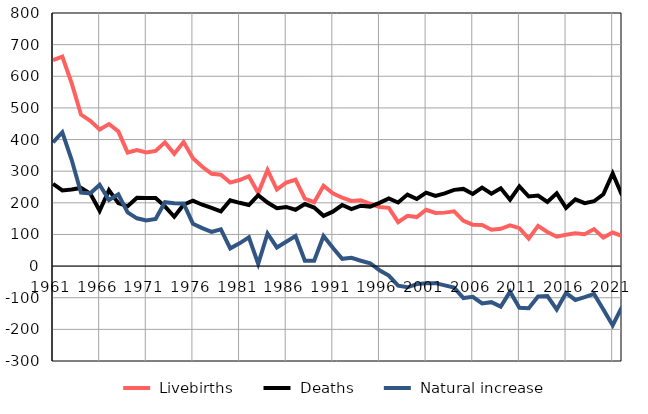
| Category |  Livebirths |  Deaths |  Natural increase |
|---|---|---|---|
| 1961.0 | 651 | 260 | 391 |
| 1962.0 | 662 | 239 | 423 |
| 1963.0 | 578 | 242 | 336 |
| 1964.0 | 479 | 247 | 232 |
| 1965.0 | 459 | 229 | 230 |
| 1966.0 | 432 | 175 | 257 |
| 1967.0 | 449 | 240 | 209 |
| 1968.0 | 426 | 199 | 227 |
| 1969.0 | 359 | 189 | 170 |
| 1970.0 | 367 | 216 | 151 |
| 1971.0 | 359 | 215 | 144 |
| 1972.0 | 364 | 215 | 149 |
| 1973.0 | 391 | 189 | 202 |
| 1974.0 | 355 | 156 | 199 |
| 1975.0 | 392 | 194 | 198 |
| 1976.0 | 341 | 207 | 134 |
| 1977.0 | 314 | 194 | 120 |
| 1978.0 | 292 | 184 | 108 |
| 1979.0 | 289 | 173 | 116 |
| 1980.0 | 264 | 208 | 56 |
| 1981.0 | 272 | 200 | 72 |
| 1982.0 | 284 | 193 | 91 |
| 1983.0 | 231 | 224 | 7 |
| 1984.0 | 304 | 201 | 103 |
| 1985.0 | 242 | 183 | 59 |
| 1986.0 | 264 | 187 | 77 |
| 1987.0 | 273 | 178 | 95 |
| 1988.0 | 213 | 196 | 17 |
| 1989.0 | 202 | 185 | 17 |
| 1990.0 | 254 | 159 | 95 |
| 1991.0 | 230 | 172 | 58 |
| 1992.0 | 216 | 193 | 23 |
| 1993.0 | 206 | 180 | 26 |
| 1994.0 | 208 | 191 | 17 |
| 1995.0 | 197 | 188 | 9 |
| 1996.0 | 187 | 200 | -13 |
| 1997.0 | 184 | 214 | -30 |
| 1998.0 | 139 | 201 | -62 |
| 1999.0 | 159 | 226 | -67 |
| 2000.0 | 155 | 212 | -57 |
| 2001.0 | 178 | 232 | -54 |
| 2002.0 | 168 | 222 | -54 |
| 2003.0 | 169 | 230 | -61 |
| 2004.0 | 173 | 241 | -68 |
| 2005.0 | 143 | 244 | -101 |
| 2006.0 | 131 | 228 | -97 |
| 2007.0 | 130 | 248 | -118 |
| 2008.0 | 115 | 229 | -114 |
| 2009.0 | 118 | 246 | -128 |
| 2010.0 | 129 | 210 | -81 |
| 2011.0 | 120 | 252 | -132 |
| 2012.0 | 87 | 220 | -133 |
| 2013.0 | 127 | 223 | -96 |
| 2014.0 | 108 | 203 | -95 |
| 2015.0 | 93 | 230 | -137 |
| 2016.0 | 99 | 184 | -85 |
| 2017.0 | 104 | 211 | -107 |
| 2018.0 | 101 | 199 | -98 |
| 2019.0 | 117 | 205 | -88 |
| 2020.0 | 90 | 227 | -137 |
| 2021.0 | 106 | 293 | -187 |
| 2022.0 | 95 | 224 | -129 |